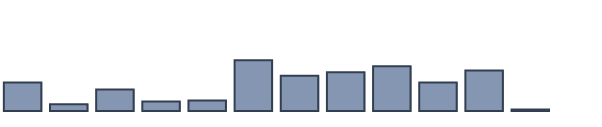
| Category | Series 0 |
|---|---|
| 0 | 9 |
| 1 | 2.1 |
| 2 | 6.8 |
| 3 | 3 |
| 4 | 3.3 |
| 5 | 16 |
| 6 | 11.1 |
| 7 | 12.2 |
| 8 | 14.1 |
| 9 | 9 |
| 10 | 12.8 |
| 11 | 0.5 |
| 12 | 0 |